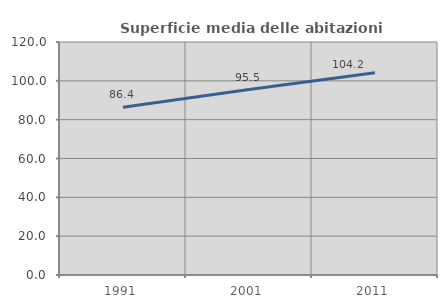
| Category | Superficie media delle abitazioni occupate |
|---|---|
| 1991.0 | 86.404 |
| 2001.0 | 95.497 |
| 2011.0 | 104.21 |